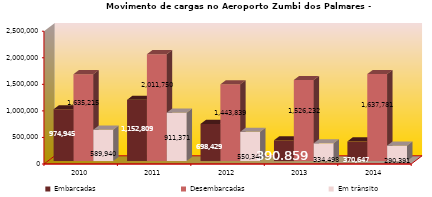
| Category | Embarcadas | Desembarcadas | Em trânsito |
|---|---|---|---|
| 2010.0 | 974945 | 1635215 | 589940 |
| 2011.0 | 1152809 | 2011750 | 911371 |
| 2012.0 | 698429 | 1443839 | 550346 |
| 2013.0 | 390859 | 1526232 | 334498 |
| 2014.0 | 370647 | 1637781 | 290391 |